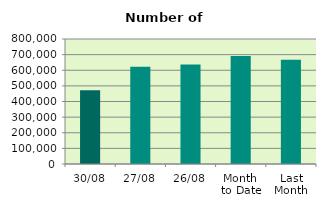
| Category | Series 0 |
|---|---|
| 30/08 | 472380 |
| 27/08 | 622526 |
| 26/08 | 636340 |
| Month 
to Date | 691025.81 |
| Last
Month | 667427.091 |